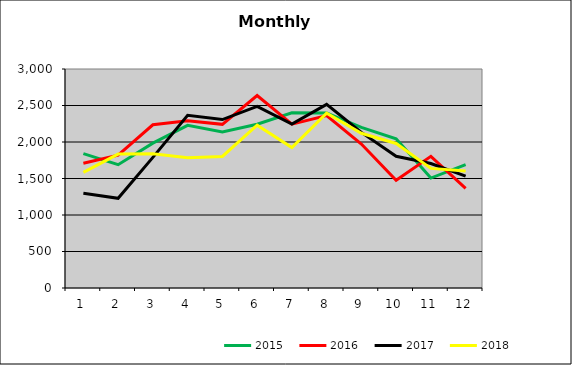
| Category | 2015 | 2016 | 2017 | 2018 |
|---|---|---|---|---|
| 0 | 1840.287 | 1709.692 | 1297.347 | 1584.945 |
| 1 | 1689.437 | 1818.591 | 1228.546 | 1834.566 |
| 2 | 1984.247 | 2235.971 | 1789.782 | 1838.878 |
| 3 | 2228.645 | 2290.052 | 2364.914 | 1785.082 |
| 4 | 2137.722 | 2241.602 | 2307.576 | 1801.761 |
| 5 | 2243.789 | 2636.687 | 2488.575 | 2229.629 |
| 6 | 2399.136 | 2245.31 | 2244.746 | 1923.685 |
| 7 | 2398.707 | 2362.2 | 2515.952 | 2394.922 |
| 8 | 2201.336 | 1971.49 | 2131.972 | 2119.853 |
| 9 | 2044.473 | 1477.1 | 1804.009 | 1979.952 |
| 10 | 1505.745 | 1802.993 | 1705.861 | 1638.435 |
| 11 | 1689.497 | 1366.089 | 1533.212 | 1603.694 |